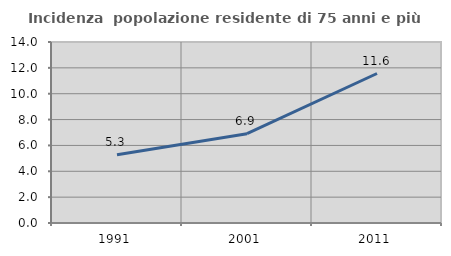
| Category | Incidenza  popolazione residente di 75 anni e più |
|---|---|
| 1991.0 | 5.276 |
| 2001.0 | 6.91 |
| 2011.0 | 11.563 |